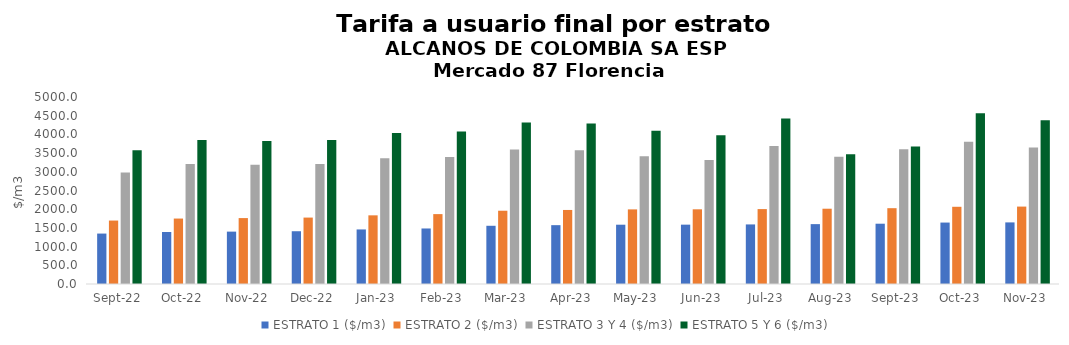
| Category | ESTRATO 1 ($/m3) | ESTRATO 2 ($/m3) | ESTRATO 3 Y 4 ($/m3) | ESTRATO 5 Y 6 ($/m3) |
|---|---|---|---|---|
| 2022-09-01 | 1348.44 | 1696.41 | 2979.32 | 3575.184 |
| 2022-10-01 | 1390.28 | 1750.02 | 3208.12 | 3849.744 |
| 2022-11-01 | 1400.42 | 1762.52 | 3185.9 | 3823.08 |
| 2022-12-01 | 1410.99 | 1776 | 3209.93 | 3851.916 |
| 2023-01-01 | 1458.78 | 1836 | 3365.49 | 4038.588 |
| 2023-02-01 | 1484.64 | 1868.8 | 3398.26 | 4077.912 |
| 2023-03-01 | 1556.75 | 1959.18 | 3596.1 | 4315.32 |
| 2023-04-01 | 1573.28 | 1979.65 | 3575.22 | 4290.264 |
| 2023-05-01 | 1585.35 | 1995.07 | 3416.65 | 4099.98 |
| 2023-06-01 | 1586.86 | 1997.09 | 3316.57 | 3979.884 |
| 2023-07-01 | 1592.9 | 2003.01 | 3689.81 | 4427.772 |
| 2023-08-01 | 1600.9 | 2012.86 | 3401.48 | 3469.51 |
| 2023-09-01 | 1612.14 | 2027.25 | 3603.59 | 3675.662 |
| 2023-10-01 | 1642.77 | 2064.53 | 3805.44 | 4566.528 |
| 2023-11-01 | 1647.01 | 2069.85 | 3648.51 | 4378.212 |